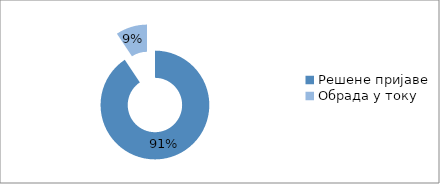
| Category | Series 0 |
|---|---|
| Решене пријаве | 13241 |
| Обрада у току | 1367 |